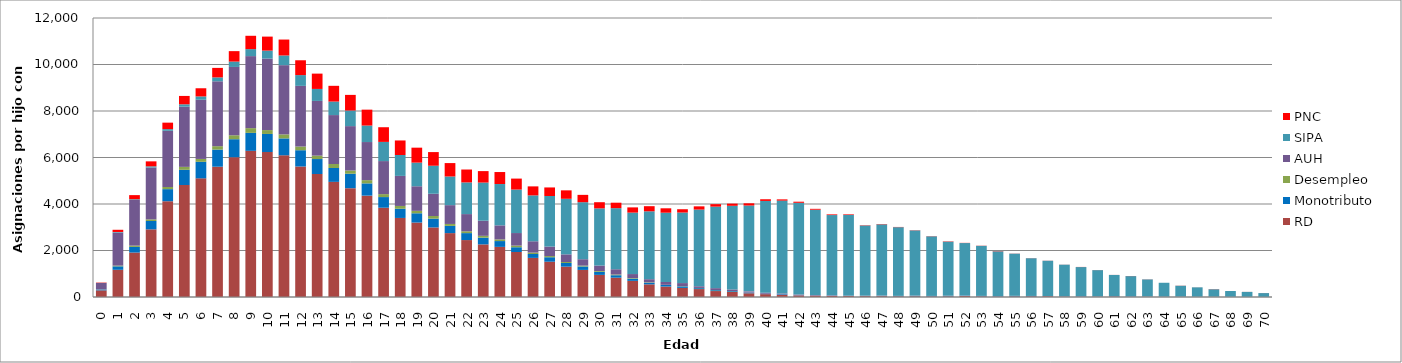
| Category | RD | Monotributo | Desempleo | AUH | SIPA | PNC |
|---|---|---|---|---|---|---|
| 0.0 | 286 | 37 | 6 | 273 | 4 | 15 |
| 1.0 | 1170 | 149 | 31 | 1421 | 26 | 94 |
| 2.0 | 1912 | 242 | 56 | 1966 | 30 | 176 |
| 3.0 | 2910 | 359 | 70 | 2231 | 50 | 214 |
| 4.0 | 4120 | 519 | 93 | 2416 | 73 | 278 |
| 5.0 | 4817 | 653 | 127 | 2589 | 102 | 360 |
| 6.0 | 5104 | 710 | 124 | 2546 | 143 | 351 |
| 7.0 | 5604 | 736 | 147 | 2791 | 167 | 409 |
| 8.0 | 6012 | 775 | 169 | 2939 | 231 | 449 |
| 9.0 | 6287 | 772 | 204 | 3098 | 301 | 573 |
| 10.0 | 6235 | 777 | 167 | 3076 | 343 | 602 |
| 11.0 | 6095 | 727 | 172 | 2978 | 416 | 685 |
| 12.0 | 5613 | 700 | 159 | 2609 | 463 | 638 |
| 13.0 | 5290 | 644 | 147 | 2352 | 516 | 659 |
| 14.0 | 4952 | 597 | 171 | 2105 | 581 | 677 |
| 15.0 | 4680 | 622 | 139 | 1909 | 671 | 672 |
| 16.0 | 4359 | 528 | 139 | 1639 | 709 | 684 |
| 17.0 | 3840 | 458 | 127 | 1421 | 825 | 631 |
| 18.0 | 3400 | 396 | 120 | 1293 | 899 | 625 |
| 19.0 | 3202 | 399 | 105 | 1057 | 1017 | 643 |
| 20.0 | 2992 | 379 | 112 | 958 | 1205 | 587 |
| 21.0 | 2748 | 311 | 83 | 809 | 1232 | 577 |
| 22.0 | 2449 | 299 | 79 | 739 | 1363 | 554 |
| 23.0 | 2263 | 290 | 78 | 650 | 1641 | 493 |
| 24.0 | 2156 | 250 | 72 | 603 | 1778 | 516 |
| 25.0 | 1935 | 205 | 71 | 540 | 1871 | 471 |
| 26.0 | 1682 | 168 | 61 | 486 | 1973 | 388 |
| 27.0 | 1518 | 192 | 51 | 408 | 2176 | 367 |
| 28.0 | 1306 | 156 | 44 | 328 | 2390 | 363 |
| 29.0 | 1165 | 148 | 37 | 275 | 2453 | 315 |
| 30.0 | 951 | 134 | 33 | 235 | 2459 | 265 |
| 31.0 | 832 | 105 | 30 | 227 | 2627 | 235 |
| 32.0 | 694 | 95 | 25 | 173 | 2643 | 224 |
| 33.0 | 544 | 72 | 17 | 133 | 2920 | 220 |
| 34.0 | 450 | 65 | 9 | 121 | 2981 | 189 |
| 35.0 | 391 | 66 | 10 | 132 | 3034 | 142 |
| 36.0 | 341 | 40 | 9 | 72 | 3299 | 138 |
| 37.0 | 256 | 37 | 9 | 79 | 3506 | 106 |
| 38.0 | 219 | 33 | 7 | 65 | 3599 | 93 |
| 39.0 | 161 | 29 | 3 | 49 | 3693 | 95 |
| 40.0 | 123 | 17 | 1 | 43 | 3948 | 72 |
| 41.0 | 90 | 27 | 1 | 33 | 3995 | 53 |
| 42.0 | 67 | 7 | 1 | 31 | 3946 | 47 |
| 43.0 | 59 | 11 | 1 | 19 | 3665 | 37 |
| 44.0 | 47 | 11 | 0 | 16 | 3451 | 28 |
| 45.0 | 40 | 7 | 0 | 11 | 3473 | 25 |
| 46.0 | 37 | 11 | 2 | 9 | 3017 | 13 |
| 47.0 | 36 | 14 | 2 | 12 | 3062 | 15 |
| 48.0 | 27 | 12 | 1 | 8 | 2955 | 10 |
| 49.0 | 31 | 16 | 1 | 12 | 2805 | 9 |
| 50.0 | 23 | 15 | 0 | 8 | 2564 | 8 |
| 51.0 | 28 | 14 | 2 | 11 | 2326 | 14 |
| 52.0 | 41 | 15 | 0 | 8 | 2257 | 7 |
| 53.0 | 26 | 12 | 0 | 9 | 2153 | 7 |
| 54.0 | 18 | 15 | 0 | 4 | 1927 | 11 |
| 55.0 | 27 | 17 | 0 | 6 | 1815 | 5 |
| 56.0 | 30 | 13 | 0 | 2 | 1623 | 4 |
| 57.0 | 32 | 5 | 1 | 3 | 1519 | 4 |
| 58.0 | 19 | 6 | 0 | 3 | 1363 | 3 |
| 59.0 | 15 | 13 | 1 | 5 | 1254 | 5 |
| 60.0 | 16 | 7 | 0 | 4 | 1129 | 3 |
| 61.0 | 23 | 10 | 0 | 3 | 913 | 2 |
| 62.0 | 12 | 13 | 0 | 4 | 870 | 5 |
| 63.0 | 15 | 3 | 1 | 2 | 736 | 4 |
| 64.0 | 11 | 5 | 0 | 1 | 595 | 1 |
| 65.0 | 11 | 4 | 0 | 3 | 466 | 5 |
| 66.0 | 8 | 1 | 0 | 0 | 407 | 2 |
| 67.0 | 11 | 1 | 0 | 0 | 322 | 6 |
| 68.0 | 6 | 2 | 0 | 0 | 249 | 1 |
| 69.0 | 2 | 1 | 0 | 1 | 216 | 2 |
| 70.0 | 3 | 0 | 0 | 0 | 166 | 2 |